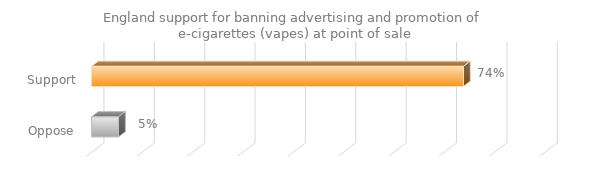
| Category | England support for banning advertising and promotion of e-cigarettes (vapes) at point of sale |
|---|---|
| Support | 0.738 |
| Oppose | 0.054 |